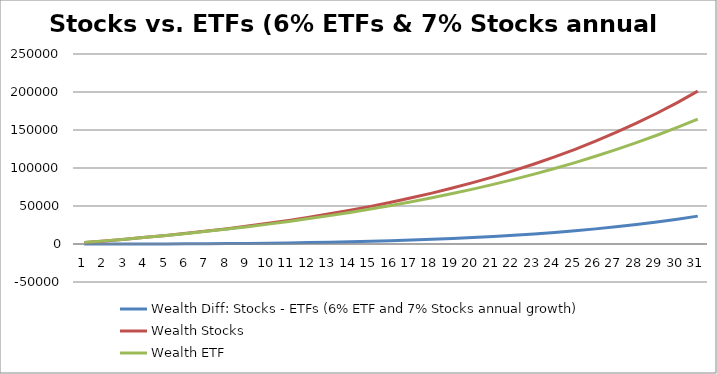
| Category | Wealth Diff: Stocks - ETFs (6% ETF and 7% Stocks annual growth) | Wealth Stocks | Wealth ETF |
|---|---|---|---|
| 0 | -30 | 1970 | 2000 |
| 1 | -38.708 | 4077.9 | 4116.608 |
| 2 | -23.27 | 6333.353 | 6356.623 |
| 3 | 19.448 | 8746.688 | 8727.239 |
| 4 | 92.884 | 11328.956 | 11236.072 |
| 5 | 200.803 | 14091.983 | 13891.18 |
| 6 | 347.33 | 17048.422 | 16701.092 |
| 7 | 536.979 | 20211.811 | 19674.832 |
| 8 | 774.684 | 23596.638 | 22821.953 |
| 9 | 1065.838 | 27218.402 | 26152.565 |
| 10 | 1416.327 | 31093.691 | 29677.364 |
| 11 | 1832.576 | 35240.249 | 33407.673 |
| 12 | 2321.593 | 39677.066 | 37355.474 |
| 13 | 2891.014 | 44424.461 | 41533.447 |
| 14 | 3549.16 | 49504.173 | 45955.013 |
| 15 | 4305.091 | 54939.465 | 50634.374 |
| 16 | 5168.667 | 60755.228 | 55586.561 |
| 17 | 6150.614 | 66978.094 | 60827.48 |
| 18 | 7262.595 | 73636.561 | 66373.965 |
| 19 | 8517.287 | 80761.12 | 72243.833 |
| 20 | 9928.461 | 88384.398 | 78455.937 |
| 21 | 11511.074 | 96541.306 | 85030.232 |
| 22 | 13281.363 | 105269.198 | 91987.835 |
| 23 | 15256.948 | 114608.041 | 99351.094 |
| 24 | 17456.945 | 124600.604 | 107143.66 |
| 25 | 19902.083 | 135292.647 | 115390.564 |
| 26 | 22614.837 | 146733.132 | 124118.295 |
| 27 | 25619.563 | 158974.451 | 133354.888 |
| 28 | 28942.651 | 172072.663 | 143130.012 |
| 29 | 32612.685 | 186087.749 | 153475.064 |
| 30 | 36660.618 | 201083.891 | 164423.274 |